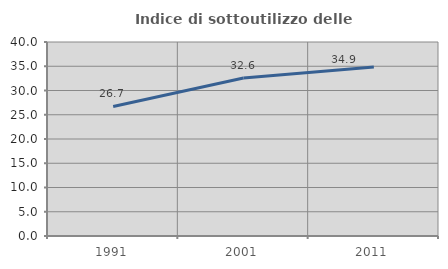
| Category | Indice di sottoutilizzo delle abitazioni  |
|---|---|
| 1991.0 | 26.705 |
| 2001.0 | 32.573 |
| 2011.0 | 34.865 |